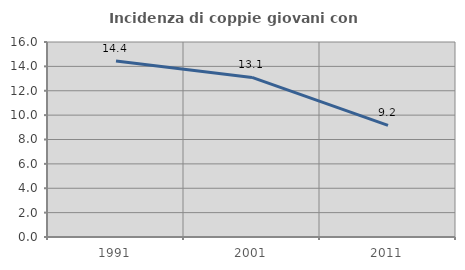
| Category | Incidenza di coppie giovani con figli |
|---|---|
| 1991.0 | 14.44 |
| 2001.0 | 13.095 |
| 2011.0 | 9.16 |